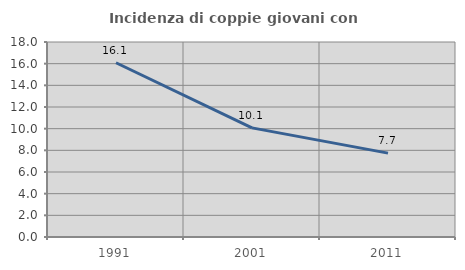
| Category | Incidenza di coppie giovani con figli |
|---|---|
| 1991.0 | 16.086 |
| 2001.0 | 10.072 |
| 2011.0 | 7.744 |